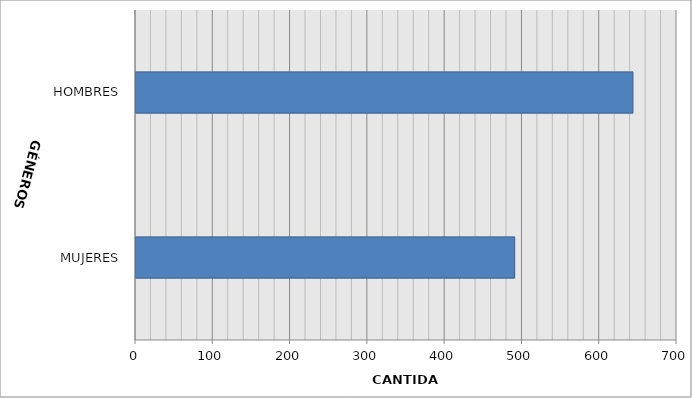
| Category | Series 0 |
|---|---|
| MUJERES | 490 |
| HOMBRES | 643 |